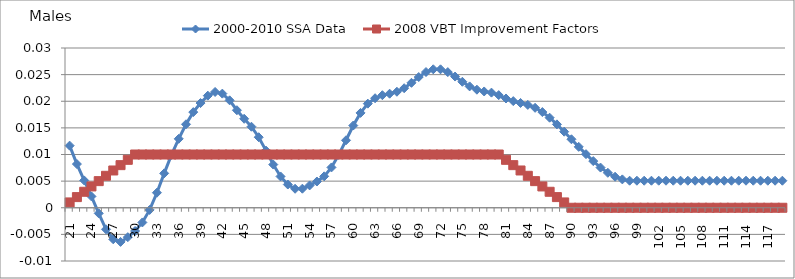
| Category | 2000-2010 SSA Data | 2008 VBT Improvement Factors |
|---|---|---|
| 21.0 | 0.012 | 0.001 |
| 22.0 | 0.008 | 0.002 |
| 23.0 | 0.005 | 0.003 |
| 24.0 | 0.002 | 0.004 |
| 25.0 | -0.001 | 0.005 |
| 26.0 | -0.004 | 0.006 |
| 27.0 | -0.006 | 0.007 |
| 28.0 | -0.006 | 0.008 |
| 29.0 | -0.006 | 0.009 |
| 30.0 | -0.004 | 0.01 |
| 31.0 | -0.003 | 0.01 |
| 32.0 | 0 | 0.01 |
| 33.0 | 0.003 | 0.01 |
| 34.0 | 0.006 | 0.01 |
| 35.0 | 0.01 | 0.01 |
| 36.0 | 0.013 | 0.01 |
| 37.0 | 0.016 | 0.01 |
| 38.0 | 0.018 | 0.01 |
| 39.0 | 0.02 | 0.01 |
| 40.0 | 0.021 | 0.01 |
| 41.0 | 0.022 | 0.01 |
| 42.0 | 0.021 | 0.01 |
| 43.0 | 0.02 | 0.01 |
| 44.0 | 0.018 | 0.01 |
| 45.0 | 0.017 | 0.01 |
| 46.0 | 0.015 | 0.01 |
| 47.0 | 0.013 | 0.01 |
| 48.0 | 0.011 | 0.01 |
| 49.0 | 0.008 | 0.01 |
| 50.0 | 0.006 | 0.01 |
| 51.0 | 0.004 | 0.01 |
| 52.0 | 0.004 | 0.01 |
| 53.0 | 0.004 | 0.01 |
| 54.0 | 0.004 | 0.01 |
| 55.0 | 0.005 | 0.01 |
| 56.0 | 0.006 | 0.01 |
| 57.0 | 0.008 | 0.01 |
| 58.0 | 0.01 | 0.01 |
| 59.0 | 0.013 | 0.01 |
| 60.0 | 0.015 | 0.01 |
| 61.0 | 0.018 | 0.01 |
| 62.0 | 0.02 | 0.01 |
| 63.0 | 0.021 | 0.01 |
| 64.0 | 0.021 | 0.01 |
| 65.0 | 0.021 | 0.01 |
| 66.0 | 0.022 | 0.01 |
| 67.0 | 0.022 | 0.01 |
| 68.0 | 0.023 | 0.01 |
| 69.0 | 0.025 | 0.01 |
| 70.0 | 0.025 | 0.01 |
| 71.0 | 0.026 | 0.01 |
| 72.0 | 0.026 | 0.01 |
| 73.0 | 0.025 | 0.01 |
| 74.0 | 0.025 | 0.01 |
| 75.0 | 0.024 | 0.01 |
| 76.0 | 0.023 | 0.01 |
| 77.0 | 0.022 | 0.01 |
| 78.0 | 0.022 | 0.01 |
| 79.0 | 0.022 | 0.01 |
| 80.0 | 0.021 | 0.01 |
| 81.0 | 0.021 | 0.009 |
| 82.0 | 0.02 | 0.008 |
| 83.0 | 0.02 | 0.007 |
| 84.0 | 0.019 | 0.006 |
| 85.0 | 0.019 | 0.005 |
| 86.0 | 0.018 | 0.004 |
| 87.0 | 0.017 | 0.003 |
| 88.0 | 0.016 | 0.002 |
| 89.0 | 0.014 | 0.001 |
| 90.0 | 0.013 | 0 |
| 91.0 | 0.011 | 0 |
| 92.0 | 0.01 | 0 |
| 93.0 | 0.009 | 0 |
| 94.0 | 0.008 | 0 |
| 95.0 | 0.007 | 0 |
| 96.0 | 0.006 | 0 |
| 97.0 | 0.005 | 0 |
| 98.0 | 0.005 | 0 |
| 99.0 | 0.005 | 0 |
| 100.0 | 0.005 | 0 |
| 101.0 | 0.005 | 0 |
| 102.0 | 0.005 | 0 |
| 103.0 | 0.005 | 0 |
| 104.0 | 0.005 | 0 |
| 105.0 | 0.005 | 0 |
| 106.0 | 0.005 | 0 |
| 107.0 | 0.005 | 0 |
| 108.0 | 0.005 | 0 |
| 109.0 | 0.005 | 0 |
| 110.0 | 0.005 | 0 |
| 111.0 | 0.005 | 0 |
| 112.0 | 0.005 | 0 |
| 113.0 | 0.005 | 0 |
| 114.0 | 0.005 | 0 |
| 115.0 | 0.005 | 0 |
| 116.0 | 0.005 | 0 |
| 117.0 | 0.005 | 0 |
| 118.0 | 0.005 | 0 |
| 119.0 | 0.005 | 0 |